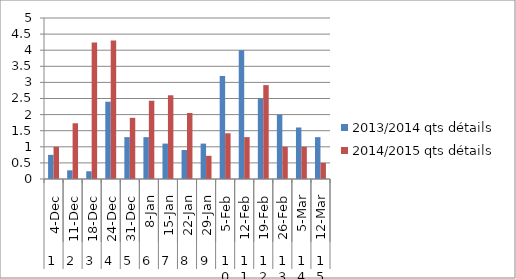
| Category | 2013/2014 qts détails | 2014/2015 qts détails |
|---|---|---|
| 0 | 0.75 | 1 |
| 1 | 0.27 | 1.73 |
| 2 | 0.24 | 4.24 |
| 3 | 2.4 | 4.3 |
| 4 | 1.3 | 1.9 |
| 5 | 1.3 | 2.43 |
| 6 | 1.1 | 2.6 |
| 7 | 0.9 | 2.05 |
| 8 | 1.1 | 0.72 |
| 9 | 3.2 | 1.42 |
| 10 | 4 | 1.3 |
| 11 | 2.5 | 2.915 |
| 12 | 2 | 1 |
| 13 | 1.6 | 1 |
| 14 | 1.3 | 0.5 |